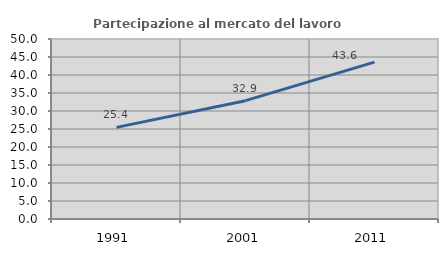
| Category | Partecipazione al mercato del lavoro  femminile |
|---|---|
| 1991.0 | 25.45 |
| 2001.0 | 32.87 |
| 2011.0 | 43.574 |